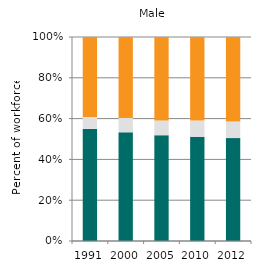
| Category | Agriculture | Industry | Services |
|---|---|---|---|
| 1991.0 | 54.946 | 5.85 | 39.204 |
| 2000.0 | 53.283 | 7.03 | 39.687 |
| 2005.0 | 51.851 | 7.271 | 40.878 |
| 2010.0 | 51.055 | 7.965 | 40.981 |
| 2012.0 | 50.434 | 8.167 | 41.4 |